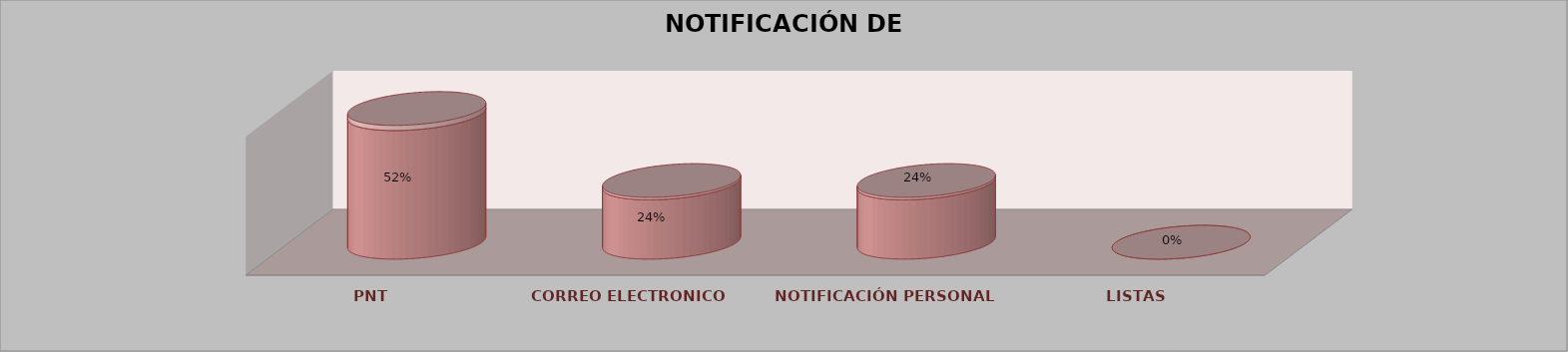
| Category | Series 0 | Series 1 | Series 2 | Series 3 | Series 4 |
|---|---|---|---|---|---|
| PNT |  |  |  | 13 | 0.52 |
| CORREO ELECTRONICO |  |  |  | 6 | 0.24 |
| NOTIFICACIÓN PERSONAL |  |  |  | 6 | 0.24 |
| LISTAS |  |  |  | 0 | 0 |